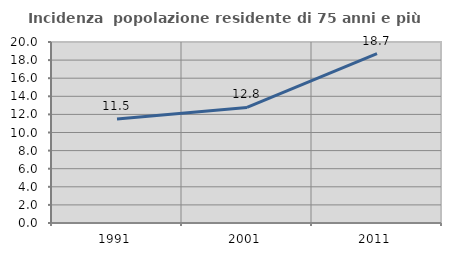
| Category | Incidenza  popolazione residente di 75 anni e più |
|---|---|
| 1991.0 | 11.491 |
| 2001.0 | 12.766 |
| 2011.0 | 18.727 |